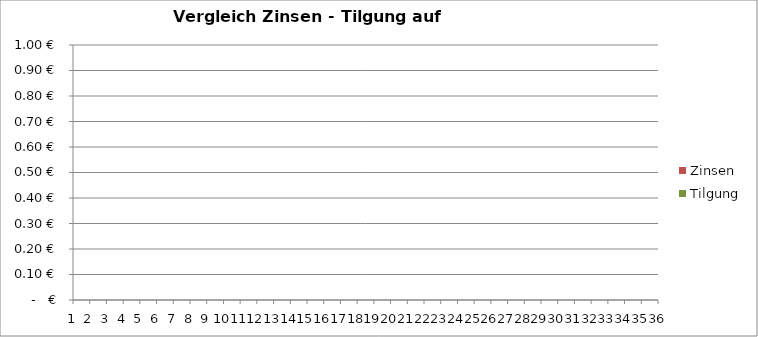
| Category | Tilgung | Zinsen |
|---|---|---|
| 0 | 0 | 0 |
| 1 | 0 | 0 |
| 2 | 0 | 0 |
| 3 | 0 | 0 |
| 4 | 0 | 0 |
| 5 | 0 | 0 |
| 6 | 0 | 0 |
| 7 | 0 | 0 |
| 8 | 0 | 0 |
| 9 | 0 | 0 |
| 10 | 0 | 0 |
| 11 | 0 | 0 |
| 12 | 0 | 0 |
| 13 | 0 | 0 |
| 14 | 0 | 0 |
| 15 | 0 | 0 |
| 16 | 0 | 0 |
| 17 | 0 | 0 |
| 18 | 0 | 0 |
| 19 | 0 | 0 |
| 20 | 0 | 0 |
| 21 | 0 | 0 |
| 22 | 0 | 0 |
| 23 | 0 | 0 |
| 24 | 0 | 0 |
| 25 | 0 | 0 |
| 26 | 0 | 0 |
| 27 | 0 | 0 |
| 28 | 0 | 0 |
| 29 | 0 | 0 |
| 30 | 0 | 0 |
| 31 | 0 | 0 |
| 32 | 0 | 0 |
| 33 | 0 | 0 |
| 34 | 0 | 0 |
| 35 | 0 | 0 |